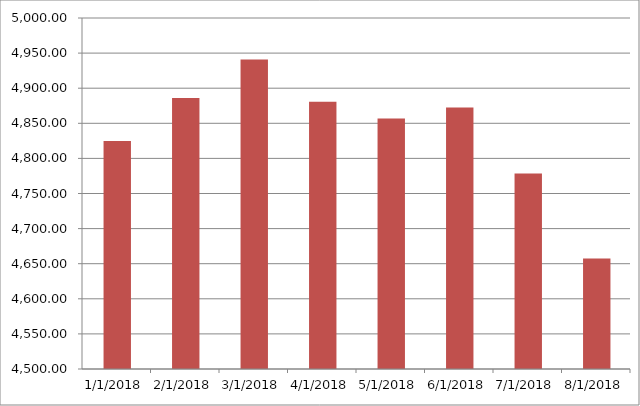
| Category | Series 0 | Series 1 |
|---|---|---|
| 1/1/18 |  | 4824.67 |
| 2/1/18 |  | 4886.02 |
| 3/1/18 |  | 4940.96 |
| 4/1/18 |  | 4880.65 |
| 5/1/18 |  | 4856.99 |
| 6/1/18 |  | 4872.61 |
| 7/1/18 |  | 4778.58 |
| 8/1/18 |  | 4657.45 |